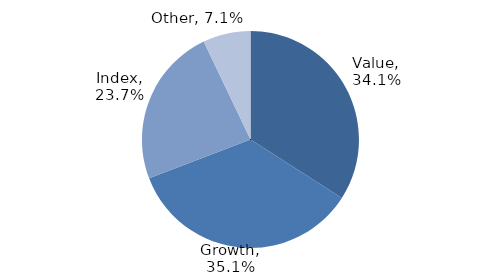
| Category | Investment Style |
|---|---|
| Value | 0.341 |
| Growth | 0.351 |
| Index | 0.237 |
| Other | 0.071 |